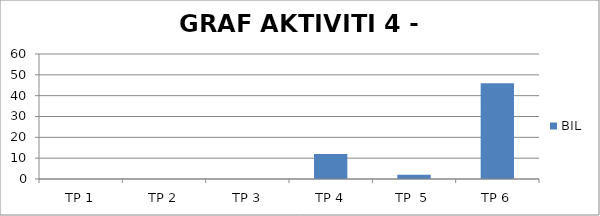
| Category | BIL |
|---|---|
| TP 1 | 0 |
| TP 2 | 0 |
|  TP 3 | 0 |
| TP 4 | 12 |
| TP  5 | 2 |
| TP 6 | 46 |